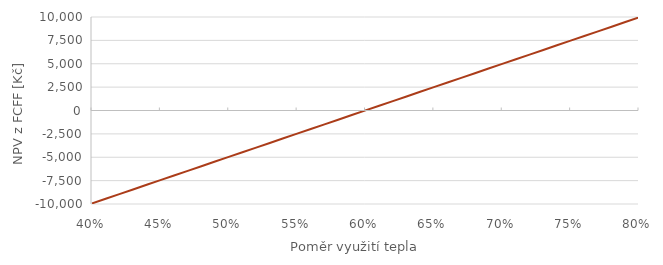
| Category | Series 0 |
|---|---|
| 0.4 | -9936643.34 |
| 0.41 | -9439255.241 |
| 0.42 | -8941867.141 |
| 0.43 | -8444479.042 |
| 0.44 | -7947090.942 |
| 0.45 | -7449702.842 |
| 0.46 | -6952314.743 |
| 0.47 | -6454926.643 |
| 0.48 | -5957538.544 |
| 0.49 | -5460150.444 |
| 0.5 | -4962762.345 |
| 0.509999999999999 | -4465374.245 |
| 0.519999999999999 | -3967986.145 |
| 0.529999999999999 | -3470598.046 |
| 0.539999999999999 | -2973209.946 |
| 0.549999999999999 | -2475821.847 |
| 0.559999999999999 | -1978433.747 |
| 0.569999999999999 | -1481045.648 |
| 0.579999999999999 | -983657.548 |
| 0.589999999999999 | -486269.448 |
| 0.599999999999999 | 11118.651 |
| 0.609999999999999 | 508506.751 |
| 0.619999999999999 | 1005894.85 |
| 0.629999999999999 | 1503282.95 |
| 0.639999999999999 | 2000671.05 |
| 0.649999999999999 | 2498059.149 |
| 0.659999999999999 | 2995447.249 |
| 0.669999999999999 | 3492835.348 |
| 0.679999999999999 | 3990223.448 |
| 0.689999999999999 | 4487611.548 |
| 0.699999999999999 | 4984999.647 |
| 0.709999999999999 | 5482387.747 |
| 0.719999999999999 | 5979775.846 |
| 0.729999999999998 | 6477163.946 |
| 0.739999999999998 | 6974552.046 |
| 0.749999999999998 | 7471940.145 |
| 0.759999999999998 | 7969328.245 |
| 0.769999999999998 | 8466716.344 |
| 0.779999999999998 | 8964104.444 |
| 0.789999999999998 | 9461492.544 |
| 0.799999999999998 | 9958880.643 |